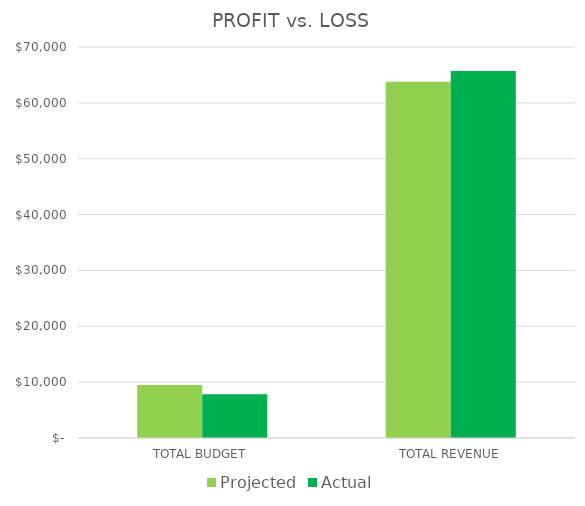
| Category | Projected | Actual |
|---|---|---|
| TOTAL BUDGET | 9500 | 7830 |
| TOTAL REVENUE | 63800 | 65725 |